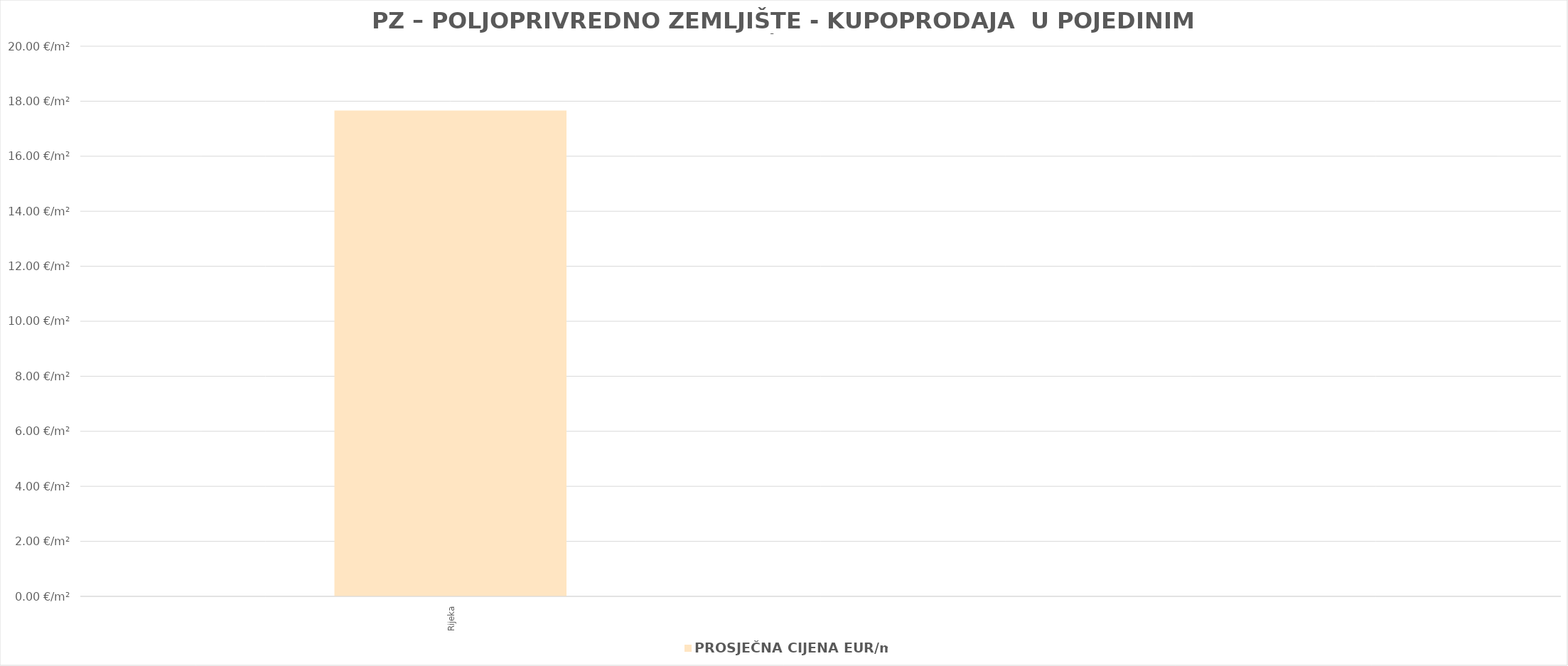
| Category | PROSJEČNA CIJENA EUR/m2 |
|---|---|
| Rijeka | 1900-01-17 15:52:56 |